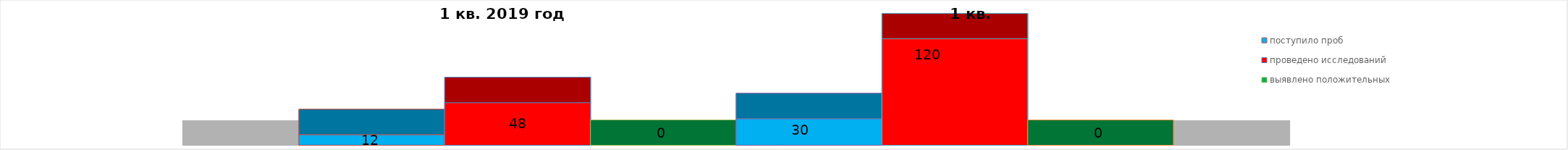
| Category | поступило проб | проведено исследований | выявлено положительных | 1 квартал 2020 год | 2016 год |
|---|---|---|---|---|---|
| 0 | 12 | 48 | 0 | 0 | 120 |